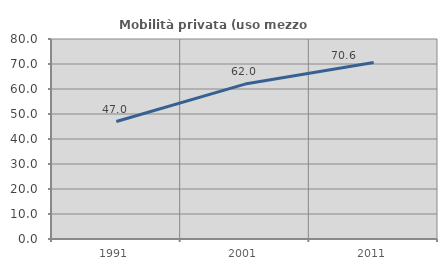
| Category | Mobilità privata (uso mezzo privato) |
|---|---|
| 1991.0 | 46.987 |
| 2001.0 | 61.971 |
| 2011.0 | 70.563 |